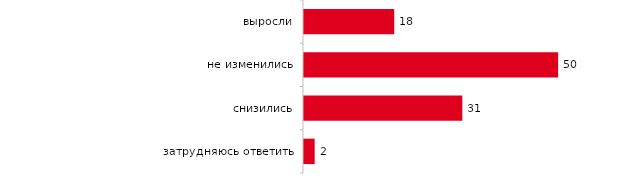
| Category | Series 0 |
|---|---|
| выросли | 17.574 |
| не изменились | 49.505 |
| снизились | 30.842 |
| затрудняюсь ответить | 2.079 |